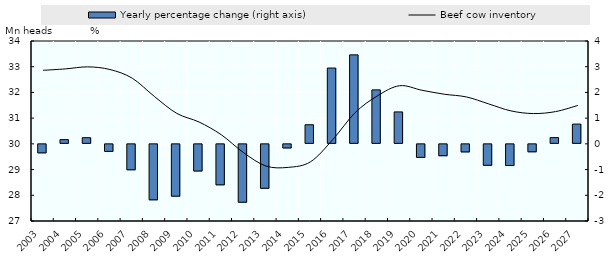
| Category | Yearly percentage change (right axis) |
|---|---|
| 2003.0 | -0.37 |
| 2004.0 | 0.164 |
| 2005.0 | 0.24 |
| 2006.0 | -0.312 |
| 2007.0 | -1.028 |
| 2008.0 | -2.196 |
| 2009.0 | -2.054 |
| 2010.0 | -1.075 |
| 2011.0 | -1.613 |
| 2012.0 | -2.291 |
| 2013.0 | -1.747 |
| 2014.0 | -0.178 |
| 2015.0 | 0.743 |
| 2016.0 | 2.949 |
| 2017.0 | 3.461 |
| 2018.0 | 2.099 |
| 2019.0 | 1.242 |
| 2020.0 | -0.545 |
| 2021.0 | -0.481 |
| 2022.0 | -0.332 |
| 2023.0 | -0.853 |
| 2024.0 | -0.861 |
| 2025.0 | -0.329 |
| 2026.0 | 0.243 |
| 2027.0 | 0.769 |